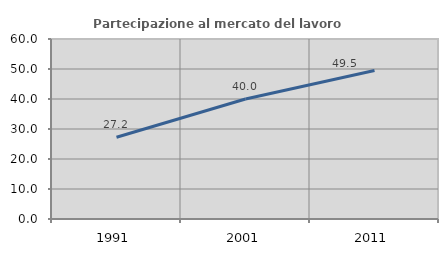
| Category | Partecipazione al mercato del lavoro  femminile |
|---|---|
| 1991.0 | 27.241 |
| 2001.0 | 40 |
| 2011.0 | 49.526 |